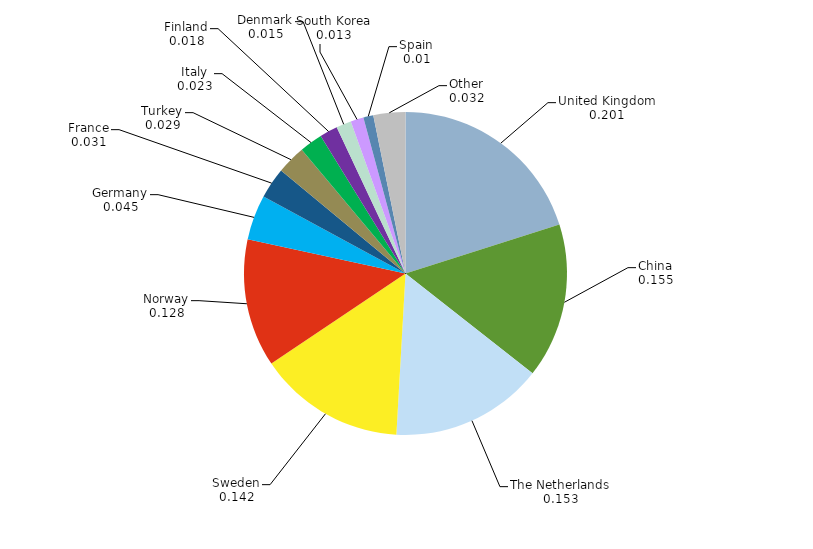
| Category | Series 0 |
|---|---|
| United Kingdom | 0.201 |
| China | 0.155 |
| The Netherlands | 0.153 |
| Sweden | 0.147 |
| Norway | 0.128 |
| Germany | 0.045 |
| France | 0.031 |
| Turkey | 0.029 |
| Italy | 0.023 |
| Finland | 0.018 |
| Denmark | 0.015 |
| South Korea | 0.013 |
| Spain | 0.01 |
| Other | 0.032 |